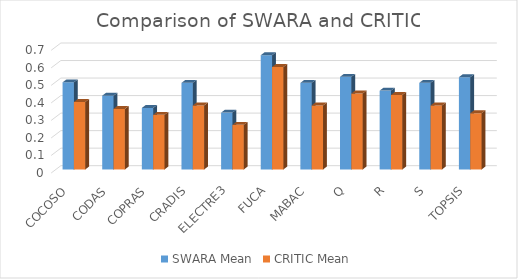
| Category | SWARA Mean | CRITIC Mean |
|---|---|---|
| COCOSO | 0.497 | 0.385 |
| CODAS | 0.421 | 0.346 |
| COPRAS | 0.351 | 0.312 |
| CRADIS | 0.494 | 0.365 |
| ELECTRE3 | 0.324 | 0.255 |
| FUCA | 0.652 | 0.584 |
| MABAC | 0.494 | 0.365 |
| Q | 0.529 | 0.433 |
| R | 0.45 | 0.425 |
| S | 0.494 | 0.365 |
| TOPSIS | 0.527 | 0.321 |